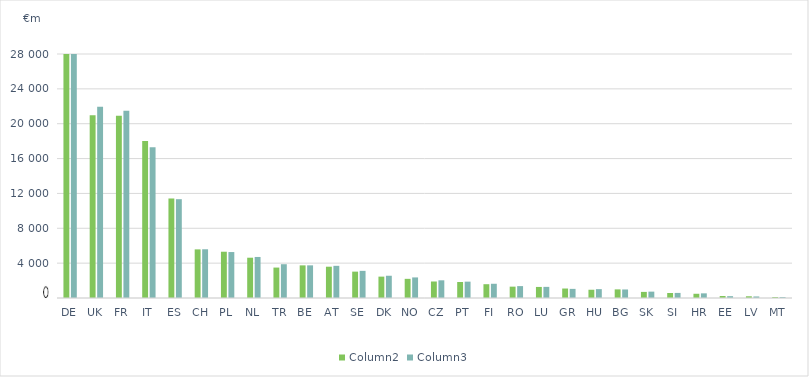
| Category | Column2 | Column3 |
|---|---|---|
| DE | 28550 | 28853 |
| UK | 20983.478 | 21935.484 |
| FR | 20906.141 | 21481.311 |
| IT | 18016 | 17300 |
| ES | 11420 | 11339 |
| CH | 5580.055 | 5592.305 |
| PL | 5310.151 | 5273.239 |
| NL | 4623 | 4709 |
| TR | 3492.123 | 3877.488 |
| BE | 3744.561 | 3746.602 |
| AT | 3591 | 3692 |
| SE | 3025.618 | 3114.795 |
| DK | 2452.845 | 2553.728 |
| NO | 2198.586 | 2360.95 |
| CZ | 1893.695 | 2030.132 |
| PT | 1839 | 1877 |
| FI | 1584 | 1633 |
| RO | 1302.73 | 1364.529 |
| LU | 1269.073 | 1276.988 |
| GR | 1088 | 1047 |
| HU | 946.585 | 1016.475 |
| BG | 989.646 | 978.73 |
| SK | 700 | 731 |
| SI | 573.27 | 582.92 |
| HR | 485.779 | 534.198 |
| EE | 228.31 | 209.14 |
| LV | 196.9 | 177.1 |
| MT | 104.79 | 105.21 |